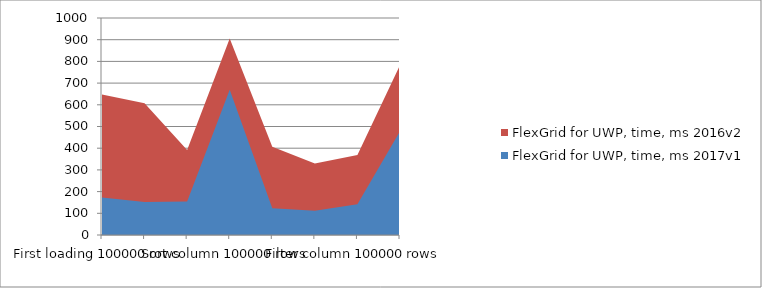
| Category | FlexGrid for UWP, time, ms 2016v2 | FlexGrid for UWP, time, ms 2017v1 |
|---|---|---|
| First loading 100000 rows | 647 | 173 |
| Create grid and load data 100000 rows | 607.2 | 152.5 |
| Load data 100000 rows | 391.2 | 154.1 |
| Sort column 100000 rows | 905.9 | 669.3 |
| Scroll 100 rows 100000 rows | 407.2 | 123.6 |
| Scroll full grid 100000 rows | 330 | 111.3 |
| Filter column 100000 rows | 369.2 | 142 |
| Group column 100000 rows | 783 | 477.5 |